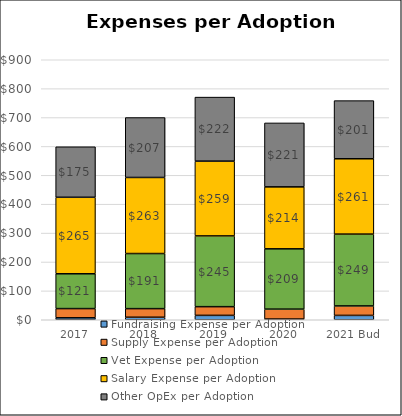
| Category | Fundraising Expense per Adoption | Supply Expense per Adoption | Vet Expense per Adoption | Salary Expense per Adoption | Other OpEx per Adoption |
|---|---|---|---|---|---|
| 2017 | 6.804 | 31.826 | 120.545 | 264.771 | 174.86 |
| 2018 | 8.663 | 29.81 | 190.695 | 263.355 | 207.485 |
| 2019 | 15.192 | 30.095 | 244.918 | 258.91 | 221.608 |
| 2020 | 2.468 | 34.306 | 208.776 | 214.417 | 221.412 |
| 2021 Bud | 15.07 | 32.837 | 248.558 | 260.841 | 201.228 |